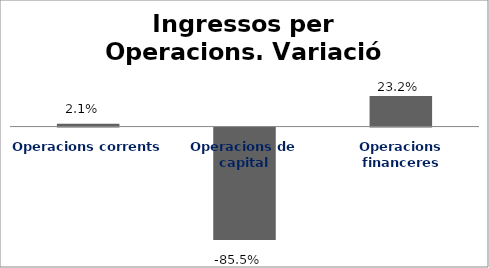
| Category | Series 0 |
|---|---|
| Operacions corrents | 0.021 |
| Operacions de capital | -0.855 |
| Operacions financeres | 0.232 |